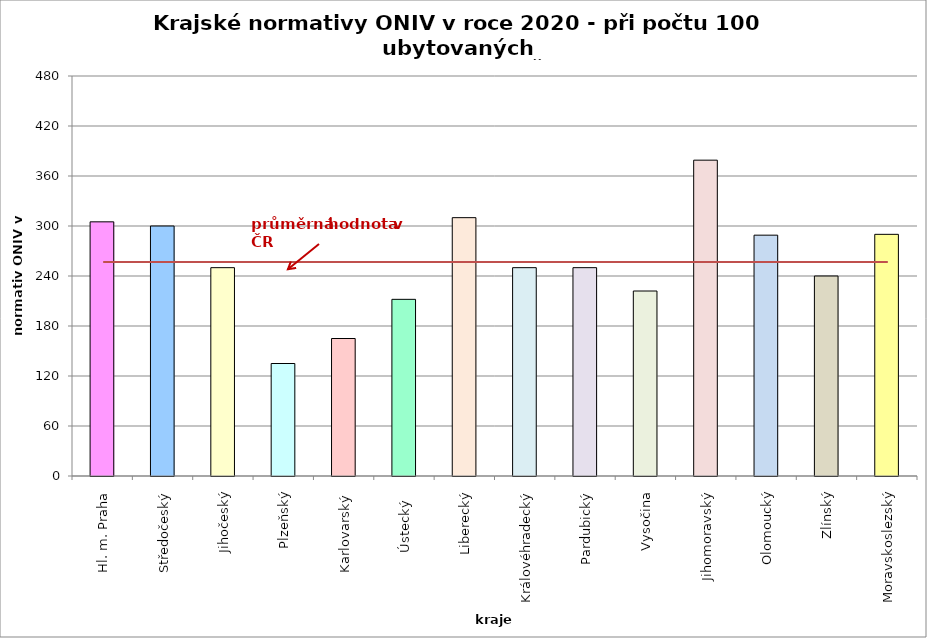
| Category | Series 0 |
|---|---|
| Hl. m. Praha | 305 |
| Středočeský | 300 |
| Jihočeský | 250 |
| Plzeňský | 135 |
| Karlovarský  | 165 |
| Ústecký   | 212 |
| Liberecký | 310 |
| Královéhradecký | 250 |
| Pardubický | 250 |
| Vysočina | 222 |
| Jihomoravský | 379 |
| Olomoucký | 289 |
| Zlínský | 240 |
| Moravskoslezský | 290 |